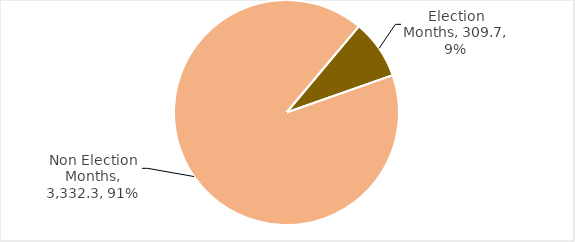
| Category | Total Grants |
|---|---|
| Election Months | 309.685 |
| Non Election Months | 3332.322 |